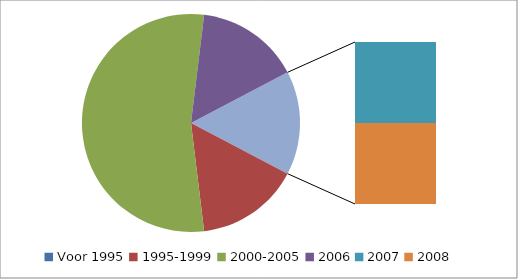
| Category | Series 0 |
|---|---|
| Voor 1995 | 0 |
| 1995-1999 | 2 |
| 2000-2005 | 7 |
| 2006 | 2 |
| 2007 | 1 |
| 2008 | 1 |